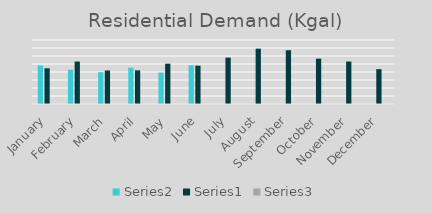
| Category | Series 1 | Series 0 | Series 2 |
|---|---|---|---|
| January | 48220 | 44639 | 1.08 |
| February | 42842.474 | 53057 | 0.807 |
| March | 39765.159 | 41882 | 0.949 |
| April | 45340.468 | 42057.867 | 1.078 |
| May | 39237.233 | 50377.601 | 0.779 |
| June | 48324.105 | 47943.133 | 1.008 |
| July | 0 | 58007.249 | 0 |
| August | 0 | 69155.328 | 0 |
| September | 0 | 67226.815 | 0 |
| October | 0 | 56697.11 | 0 |
| November | 0 | 53097.198 | 0 |
| December | 0 | 43519.04 | 0 |